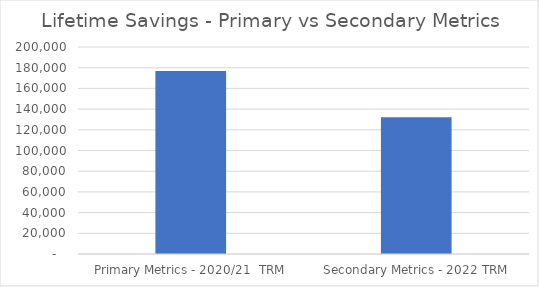
| Category | Series 0 |
|---|---|
| Primary Metrics - 2020/21  TRM | 176796.176 |
| Secondary Metrics - 2022 TRM | 132152.087 |